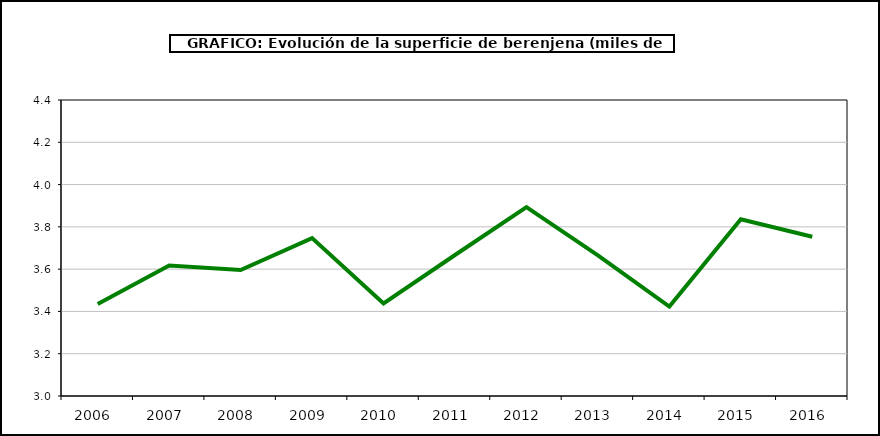
| Category | superficie |
|---|---|
| 2006.0 | 3.435 |
| 2007.0 | 3.617 |
| 2008.0 | 3.596 |
| 2009.0 | 3.747 |
| 2010.0 | 3.438 |
| 2011.0 | 3.667 |
| 2012.0 | 3.893 |
| 2013.0 | 3.665 |
| 2014.0 | 3.423 |
| 2015.0 | 3.836 |
| 2016.0 | 3.753 |